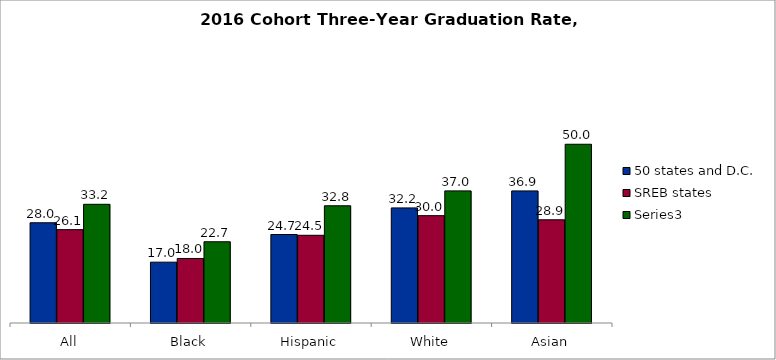
| Category | 50 states and D.C. | SREB states | Series 2 |
|---|---|---|---|
| All | 28.038 | 26.118 | 33.203 |
| Black | 17.018 | 18.047 | 22.727 |
| Hispanic | 24.749 | 24.533 | 32.79 |
| White | 32.19 | 30.028 | 36.955 |
| Asian | 36.945 | 28.868 | 50 |